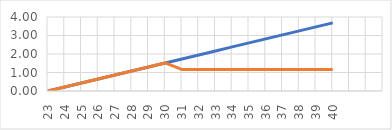
| Category | Pc(Tj)=BLc | Pc_corr(Tj) |
|---|---|---|
| 23.0 |  | 0 |
| 24.0 |  | 0.217 |
| 25.0 |  | 0.433 |
| 26.0 |  | 0.65 |
| 27.0 |  | 0.867 |
| 28.0 |  | 1.083 |
| 29.0 |  | 1.3 |
| 30.0 |  | 1.517 |
| 31.0 |  | 1.158 |
| 32.0 |  | 1.158 |
| 33.0 |  | 1.158 |
| 34.0 |  | 1.158 |
| 35.0 |  | 1.158 |
| 36.0 |  | 1.158 |
| 37.0 |  | 1.158 |
| 38.0 |  | 1.158 |
| 39.0 |  | 1.158 |
| 40.0 |  | 1.158 |